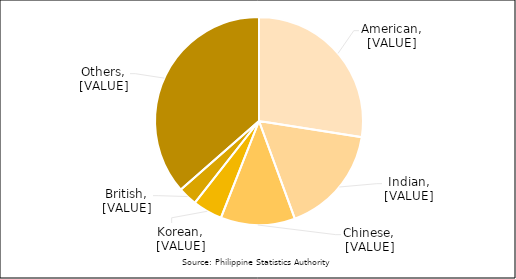
| Category | Series 0 |
|---|---|
| American | 27.483 |
| Indian | 16.921 |
| Chinese | 11.561 |
| Korean | 4.624 |
| British | 2.943 |
| Others | 36.469 |